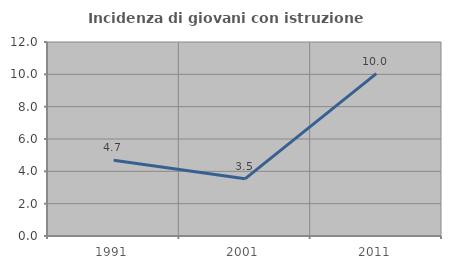
| Category | Incidenza di giovani con istruzione universitaria |
|---|---|
| 1991.0 | 4.681 |
| 2001.0 | 3.535 |
| 2011.0 | 10.046 |